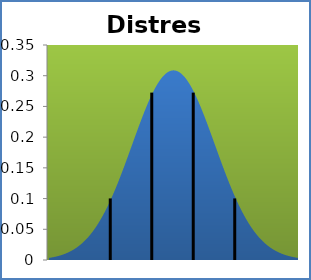
| Category | densité |
|---|---|
| -1.326 | 0.003 |
| -1.2614000000000005 | 0.004 |
| -1.1968000000000005 | 0.005 |
| -1.1322000000000005 | 0.005 |
| -1.0676000000000005 | 0.006 |
| -1.0030000000000001 | 0.007 |
| -0.9384000000000001 | 0.008 |
| -0.8738000000000001 | 0.009 |
| -0.8092000000000001 | 0.011 |
| -0.7446000000000002 | 0.012 |
| -0.6800000000000006 | 0.014 |
| -0.6154000000000002 | 0.015 |
| -0.5508000000000006 | 0.017 |
| -0.4862000000000002 | 0.02 |
| -0.4216000000000002 | 0.022 |
| -0.3570000000000002 | 0.025 |
| -0.2924000000000002 | 0.027 |
| -0.22780000000000022 | 0.031 |
| -0.16320000000000023 | 0.034 |
| -0.09860000000000024 | 0.038 |
| -0.03400000000000025 | 0.042 |
| 0.03059999999999974 | 0.046 |
| 0.09519999999999973 | 0.051 |
| 0.15979999999999972 | 0.056 |
| 0.2243999999999997 | 0.061 |
| 0.2889999999999997 | 0.067 |
| 0.3535999999999997 | 0.073 |
| 0.4181999999999997 | 0.079 |
| 0.4827999999999997 | 0.086 |
| 0.5473999999999997 | 0.093 |
| 0.6119999999999999 | 0.1 |
| 0.6765999999999996 | 0.108 |
| 0.7411999999999996 | 0.116 |
| 0.8057999999999998 | 0.124 |
| 0.8703999999999998 | 0.133 |
| 0.9349999999999996 | 0.141 |
| 0.9995999999999996 | 0.15 |
| 1.0641999999999998 | 0.159 |
| 1.1287999999999998 | 0.169 |
| 1.1933999999999998 | 0.178 |
| 1.2579999999999998 | 0.187 |
| 1.3225999999999998 | 0.197 |
| 1.3871999999999998 | 0.206 |
| 1.4517999999999998 | 0.215 |
| 1.5163999999999997 | 0.224 |
| 1.581 | 0.233 |
| 1.6455999999999997 | 0.242 |
| 1.7102 | 0.25 |
| 1.7747999999999997 | 0.258 |
| 1.8394 | 0.265 |
| 1.904 | 0.272 |
| 1.9686 | 0.279 |
| 2.0332 | 0.285 |
| 2.0978 | 0.29 |
| 2.1624 | 0.295 |
| 2.227 | 0.299 |
| 2.2916 | 0.303 |
| 2.3562 | 0.305 |
| 2.4208 | 0.307 |
| 2.4854 | 0.308 |
| 2.55 | 0.309 |
| 2.6146 | 0.308 |
| 2.6792 | 0.307 |
| 2.7438 | 0.305 |
| 2.8084 | 0.303 |
| 2.8729999999999998 | 0.299 |
| 2.9375999999999998 | 0.295 |
| 3.0021999999999998 | 0.29 |
| 3.0667999999999997 | 0.285 |
| 3.1313999999999997 | 0.279 |
| 3.1959999999999997 | 0.272 |
| 3.2605999999999997 | 0.265 |
| 3.3251999999999997 | 0.258 |
| 3.3897999999999997 | 0.25 |
| 3.4543999999999997 | 0.242 |
| 3.5189999999999997 | 0.233 |
| 3.5835999999999997 | 0.224 |
| 3.6482 | 0.215 |
| 3.7127999999999997 | 0.206 |
| 3.7774 | 0.197 |
| 3.8419999999999996 | 0.187 |
| 3.9066 | 0.178 |
| 3.9711999999999996 | 0.169 |
| 4.0358 | 0.159 |
| 4.1004000000000005 | 0.15 |
| 4.165 | 0.141 |
| 4.2296 | 0.133 |
| 4.2942 | 0.124 |
| 4.3588000000000005 | 0.116 |
| 4.4234 | 0.108 |
| 4.4879999999999995 | 0.1 |
| 4.5526 | 0.093 |
| 4.6172 | 0.086 |
| 4.6818 | 0.079 |
| 4.7463999999999995 | 0.073 |
| 4.811 | 0.067 |
| 4.8756 | 0.061 |
| 4.9402 | 0.056 |
| 5.0047999999999995 | 0.051 |
| 5.0694 | 0.046 |
| 5.134 | 0.042 |
| 5.1986 | 0.038 |
| 5.263199999999999 | 0.034 |
| 5.3278 | 0.031 |
| 5.3924 | 0.027 |
| 5.457 | 0.025 |
| 5.521599999999999 | 0.022 |
| 5.5862 | 0.02 |
| 5.6508 | 0.017 |
| 5.7154 | 0.015 |
| 5.78 | 0.014 |
| 5.8446 | 0.012 |
| 5.9092 | 0.011 |
| 5.9738 | 0.009 |
| 6.038399999999999 | 0.008 |
| 6.103 | 0.007 |
| 6.1676 | 0.006 |
| 6.232200000000001 | 0.005 |
| 6.2968 | 0.005 |
| 6.3614 | 0.004 |
| 6.426 | 0.003 |